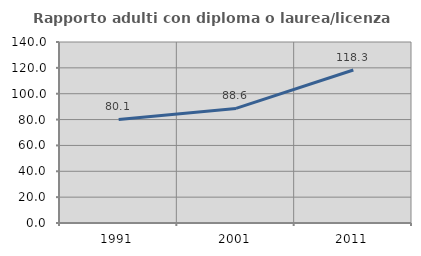
| Category | Rapporto adulti con diploma o laurea/licenza media  |
|---|---|
| 1991.0 | 80.102 |
| 2001.0 | 88.645 |
| 2011.0 | 118.339 |